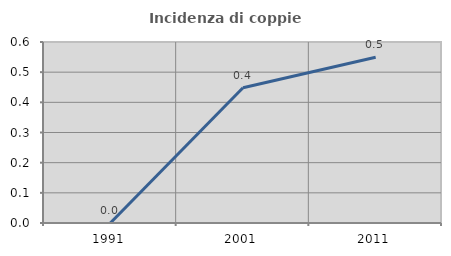
| Category | Incidenza di coppie miste |
|---|---|
| 1991.0 | 0 |
| 2001.0 | 0.448 |
| 2011.0 | 0.549 |